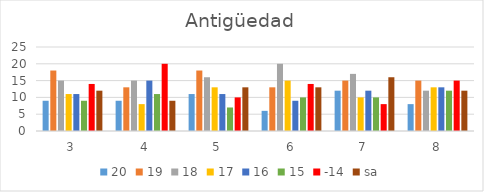
| Category | 20 | 19 | 18 | 17 | 16 | 15 | -14 | sa |
|---|---|---|---|---|---|---|---|---|
| 3.0 | 9 | 18 | 15 | 11 | 11 | 9 | 14 | 12 |
| 4.0 | 9 | 13 | 15 | 8 | 15 | 11 | 20 | 9 |
| 5.0 | 11 | 18 | 16 | 13 | 11 | 7 | 10 | 13 |
| 6.0 | 6 | 13 | 20 | 15 | 9 | 10 | 14 | 13 |
| 7.0 | 12 | 15 | 17 | 10 | 12 | 10 | 8 | 16 |
| 8.0 | 8 | 15 | 12 | 13 | 13 | 12 | 15 | 12 |